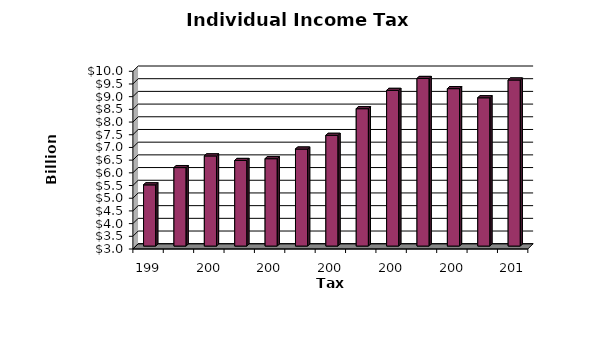
| Category | Series 0 |
|---|---|
| 1998.0 | 5.41 |
| 1999.0 | 6.09 |
| 2000.0 | 6.55 |
| 2001.0 | 6.37 |
| 2002.0 | 6.44 |
| 2003.0 | 6.82 |
| 2004.0 | 7.36 |
| 2005.0 | 8.41 |
| 2006.0 | 9.13 |
| 2007.0 | 9.6 |
| 2008.0 | 9.2 |
| 2009.0 | 8.84 |
| 2010.0 | 9.54 |